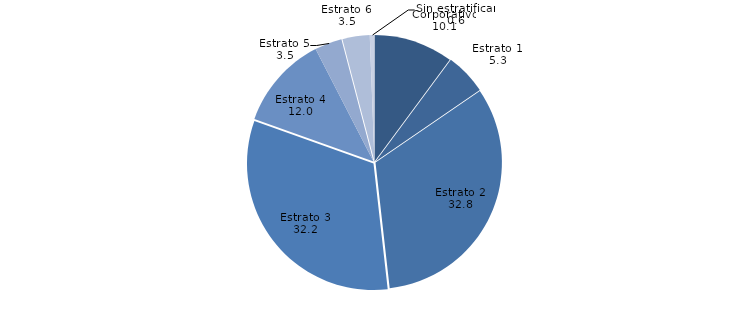
| Category | Series 0 |
|---|---|
| Corporativo | 10.143 |
| Estrato 1 | 5.286 |
| Estrato 2 | 32.759 |
| Estrato 3 | 32.239 |
| Estrato 4 | 11.964 |
| Estrato 5 | 3.485 |
| Estrato 6 | 3.482 |
| Sin estratificar | 0.599 |